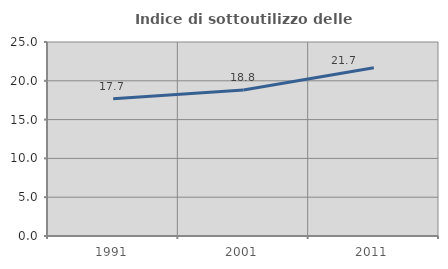
| Category | Indice di sottoutilizzo delle abitazioni  |
|---|---|
| 1991.0 | 17.701 |
| 2001.0 | 18.812 |
| 2011.0 | 21.683 |